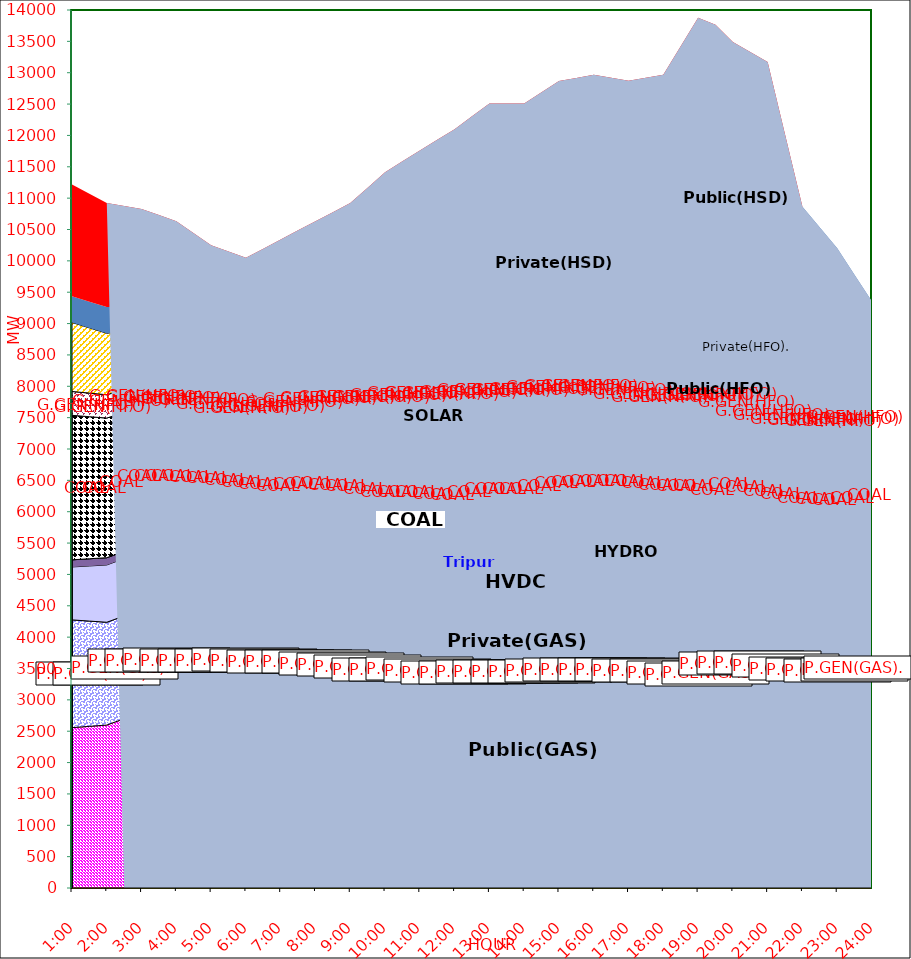
| Category | GAS | P.GEN(GAS). |  HVDC | TRIPURA | HYDRO | COAL | SOLAR | G.GEN(HFO) | P.GEN(HFO). | G.GEN(HSD) | P.GEN(HSD) | SHORTAGE | Total Energy Gen 239.401 MKWHr 
Energy Not Served   39.805 MKWHr 
Energy Requirement     279.206 MKWHr  |
|---|---|---|---|---|---|---|---|---|---|---|---|---|---|
| 1:00 | 2557 | 1718 | 844 | 114 | 0 | 2304 | 0 | 380 | 1100 | 0 | 418 | 1781.075 |  |
| 1:30 | 2577.5 | 1678.5 | 879 | 115 | 0 | 2265 | 0 | 376 | 1040 | 0 | 418.5 | 1719.477 |  |
| 2:00 | 2598 | 1639 | 914 | 116 | 0 | 2226 | 0 | 372 | 980 | 0 | 419 | 1657.88 |  |
| 2:30 | 2700 | 1639 | 914 | 114 | 0 | 2220 | 0 | 361 | 930 | 0 | 388.5 | 1607.742 |  |
| 3:00 | 2802 | 1639 | 914 | 112 | 0 | 2214 | 0 | 350 | 880 | 0 | 358 | 1557.605 |  |
| 3:30 | 2812 | 1639 | 914.5 | 111 | 0 | 2191 | 0 | 349 | 861.5 | 0 | 360 | 1491.71 |  |
| 4:00 | 2822 | 1639 | 915 | 110 | 0 | 2168 | 0 | 348 | 843 | 0 | 362 | 1425.815 |  |
| 4:30 | 2814.5 | 1636.5 | 914.5 | 109 | 0 | 2164.5 | 0 | 331.5 | 838 | 0 | 360.5 | 1271.105 |  |
| 5:00 | 2807 | 1634 | 914 | 108 | 0 | 2161 | 0 | 315 | 833 | 0 | 359 | 1116.395 |  |
| 5:30 | 2813.5 | 1636 | 914 | 104 | 0 | 2086.5 | 11 | 315.5 | 833 | 0 | 323.5 | 1110.665 |  |
| 6:00 | 2820 | 1638 | 914 | 100 | 0 | 2012 | 22 | 316 | 833 | 0 | 288 | 1104.935 |  |
| 6:30 | 2822 | 1601 | 914 | 101 | 0 | 2024.5 | 61 | 317 | 866 | 0 | 313 | 1175.128 |  |
| 7:00 | 2824 | 1564 | 914 | 102 | 0 | 2037 | 100 | 318 | 899 | 0 | 338 | 1245.32 |  |
| 7:30 | 2811.5 | 1594.5 | 913.5 | 103 | 0 | 2040.5 | 127.5 | 318 | 945 | 0 | 296.5 | 1337 |  |
| 8:00 | 2799 | 1625 | 913 | 104 | 0 | 2044 | 155 | 318 | 991 | 0 | 255 | 1428.68 |  |
| 8:30 | 2778 | 1616.5 | 913.5 | 112 | 0 | 2038.5 | 199.5 | 317 | 999.5 | 0 | 250.5 | 1551.875 |  |
| 9:00 | 2757 | 1608 | 914 | 120 | 0 | 2033 | 244 | 316 | 1008 | 0 | 246 | 1675.07 |  |
| 9:30 | 2722 | 1605 | 914 | 129 | 0 | 2001.5 | 297.5 | 339 | 1110.5 | 0 | 278.5 | 1769.615 |  |
| 10:00 | 2687 | 1602 | 914 | 138 | 0 | 1970 | 351 | 362 | 1213 | 0 | 311 | 1864.16 |  |
| 10:30 | 2698.5 | 1584 | 913.5 | 143 | 0 | 1962.5 | 383 | 378.5 | 1271.5 | 0 | 369.5 | 1882.305 |  |
| 11:00 | 2710 | 1566 | 913 | 148 | 0 | 1955 | 415 | 395 | 1330 | 0 | 428 | 1900.45 |  |
| 11:30 | 2691.5 | 1546.5 | 913 | 150 | 13.5 | 1959 | 410 | 425.5 | 1384 | 0 | 429 | 2008.365 |  |
| 12:00 | 2673 | 1527 | 913 | 152 | 27 | 1963 | 405 | 456 | 1438 | 0 | 430 | 2116.28 |  |
| 12:30 | 2674 | 1538 | 913 | 154 | 27 | 2026.5 | 362.5 | 442.5 | 1480 | 0 | 430 | 2256.665 |  |
| 13:00 | 2675 | 1549 | 913 | 156 | 27 | 2090 | 320 | 429 | 1522 | 0 | 430 | 2397.05 |  |
| 13:30 | 2675 | 1549 | 913 | 156 | 27 | 2090 | 320 | 429 | 1522 | 0 | 430 | 2397.05 |  |
| 14:00 | 2675 | 1549 | 913 | 156 | 27 | 2090 | 320 | 429 | 1522 | 0 | 430 | 2397.05 |  |
| 14:30 | 2686.5 | 1546.5 | 913 | 166 | 26 | 2158 | 249 | 450 | 1465 | 0 | 430 | 2598.077 |  |
| 15:00 | 2698 | 1544 | 913 | 176 | 25 | 2226 | 178 | 471 | 1408 | 0 | 430 | 2799.105 |  |
| 15:30 | 2703 | 1548 | 913.5 | 171 | 25 | 2248 | 160.5 | 477 | 1427 | 15 | 411 | 2818.205 |  |
| 16:00 | 2708 | 1552 | 914 | 166 | 25 | 2270 | 143 | 483 | 1446 | 30 | 392 | 2837.305 |  |
| 16:30 | 2703.5 | 1554 | 913.5 | 163 | 25 | 2276.5 | 104.5 | 481.5 | 1497.5 | 31 | 383.5 | 2785.257 |  |
| 17:00 | 2699 | 1556 | 913 | 160 | 25 | 2283 | 66 | 480 | 1549 | 32 | 375 | 2733.21 |  |
| 17:30 | 2699 | 1545 | 913.5 | 156 | 25 | 2249 | 39 | 521.5 | 1668.5 | 36.5 | 307 | 2759.95 |  |
| 18:00 | 2699 | 1534 | 914 | 152 | 25 | 2215 | 12 | 563 | 1788 | 41 | 239 | 2786.69 |  |
| 18:30 | 2668 | 1540 | 913.5 | 162 | 25 | 2225 | 6 | 628 | 2173.5 | 55.5 | 308.5 | 2716.975 |  |
| 19:00 | 2637 | 1546 | 913 | 172 | 25 | 2235 | 0 | 693 | 2559 | 70 | 378 | 2647.26 |  |
| 19:30 | 2701 | 1485 | 853 | 160 | 25 | 2260 | 0 | 764 | 2819 | 61 | 314 | 2321.127 |  |
| 20:00 | 2809 | 1554 | 853 | 162 | 25 | 2094 | 0 | 783 | 2743 | 61 | 412 | 1994.995 |  |
| 20:30 | 2798.5 | 1587.5 | 835.5 | 168 | 25 | 1965.5 | 0 | 744.5 | 2699 | 93 | 418 | 1995.95 |  |
| 21:00 | 2788 | 1621 | 818 | 174 | 25 | 1837 | 0 | 706 | 2655 | 125 | 424 | 1996.905 |  |
| 21:30 | 2746 | 1612.5 | 818.5 | 170 | 25 | 1821.5 | 0 | 707.5 | 2538 | 135.5 | 443 | 998.452 |  |
| 22:00 | 2704 | 1604 | 819 | 166 | 25 | 1806 | 0 | 709 | 2421 | 146 | 462 | 0 |  |
| 22:30 | 2680 | 1611.5 | 818.5 | 150.5 | 25 | 1845 | 0 | 672 | 2147.5 | 146 | 435.5 | 0 |  |
| 23:00 | 2656 | 1619 | 818 | 135 | 25 | 1884 | 0 | 635 | 1874 | 146 | 409 | 0 |  |
| 23:30 | 2682 | 1611.5 | 818.5 | 140.5 | 12.5 | 1937 | 0 | 565 | 1486.5 | 138.5 | 383.5 | 0 |  |
| 24:00 | 2708 | 1604 | 819 | 146 | 0 | 1990 | 0 | 495 | 1099 | 131 | 358 | 0 |  |